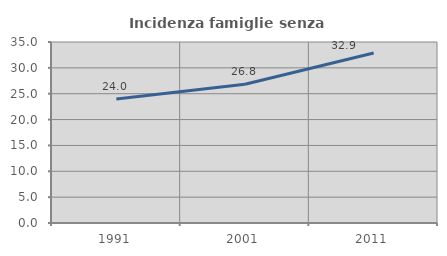
| Category | Incidenza famiglie senza nuclei |
|---|---|
| 1991.0 | 23.973 |
| 2001.0 | 26.837 |
| 2011.0 | 32.886 |